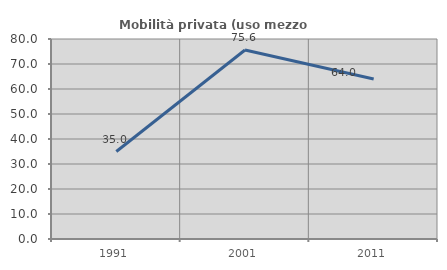
| Category | Mobilità privata (uso mezzo privato) |
|---|---|
| 1991.0 | 35 |
| 2001.0 | 75.61 |
| 2011.0 | 64 |